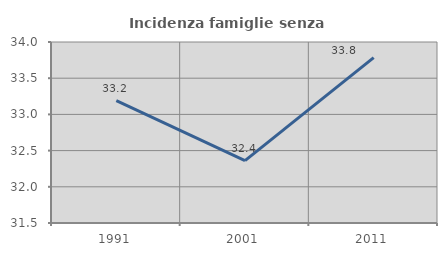
| Category | Incidenza famiglie senza nuclei |
|---|---|
| 1991.0 | 33.191 |
| 2001.0 | 32.362 |
| 2011.0 | 33.784 |